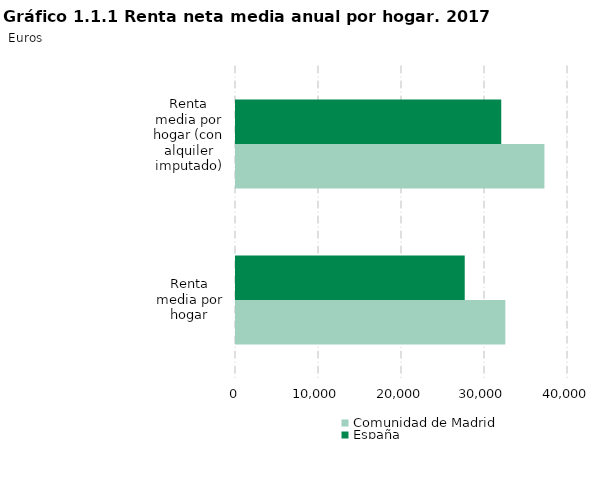
| Category | Comunidad de Madrid | España |
|---|---|---|
| Renta media por hogar | 32451 | 27558 |
| Renta media por hogar (con alquiler imputado) | 37161 | 31956 |